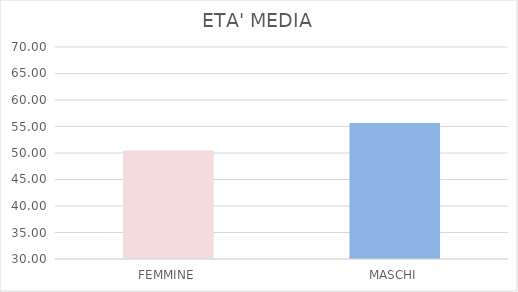
| Category | MEDIA |
|---|---|
| FEMMINE | 50.466 |
| MASCHI | 55.669 |